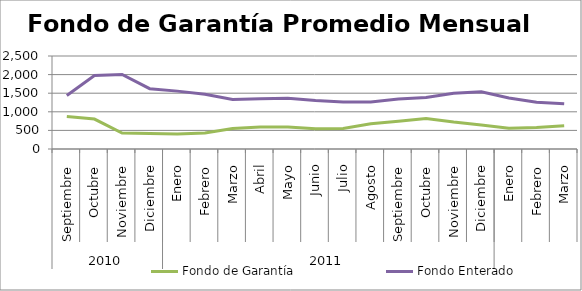
| Category | Fondo de Garantía | Fondo Enterado |
|---|---|---|
| 0 | 871.43 | 1439.553 |
| 1 | 804.208 | 1973.732 |
| 2 | 428.758 | 2004.096 |
| 3 | 417.974 | 1620.905 |
| 4 | 403.651 | 1555.632 |
| 5 | 429.02 | 1474.054 |
| 6 | 551.344 | 1328.521 |
| 7 | 591.732 | 1351.463 |
| 8 | 591.784 | 1363.301 |
| 9 | 544.875 | 1304.985 |
| 10 | 551.606 | 1265.502 |
| 11 | 679.839 | 1266.018 |
| 12 | 747.74 | 1344.929 |
| 13 | 819.75 | 1383.171 |
| 14 | 723.635 | 1501.378 |
| 15 | 648.288 | 1537.485 |
| 16 | 560.173 | 1370.992 |
| 17 | 575.916 | 1258.831 |
| 18 | 622.075 | 1216.471 |